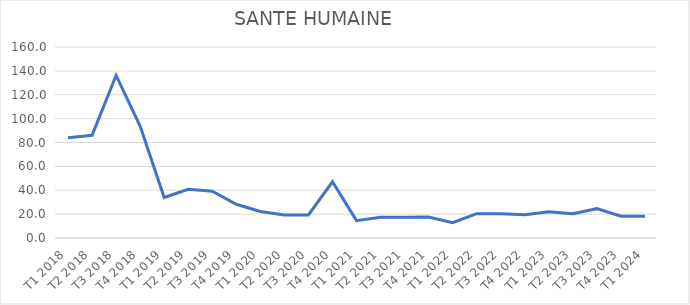
| Category | Series 0 |
|---|---|
| T1 2018 | 84.008 |
| T2 2018 | 86.047 |
| T3 2018 | 136.217 |
| T4 2018 | 93.728 |
| T1 2019 | 33.895 |
| T2 2019 | 40.854 |
| T3 2019 | 39.182 |
| T4 2019 | 28.24 |
| T1 2020 | 22.259 |
| T2 2020 | 19.351 |
| T3 2020 | 19.351 |
| T4 2020 | 47.123 |
| T1 2021 | 14.527 |
| T2 2021 | 17.447 |
| T3 2021 | 17.447 |
| T4 2021 | 17.562 |
| T1 2022 | 12.786 |
| T2 2022 | 20.405 |
| T3 2022 | 20.3 |
| T4 2022 | 19.413 |
| T1 2023 | 22.044 |
| T2 2023 | 20.405 |
| T3 2023 | 24.568 |
| T4 2023 | 18.24 |
| T1 2024 | 18.24 |